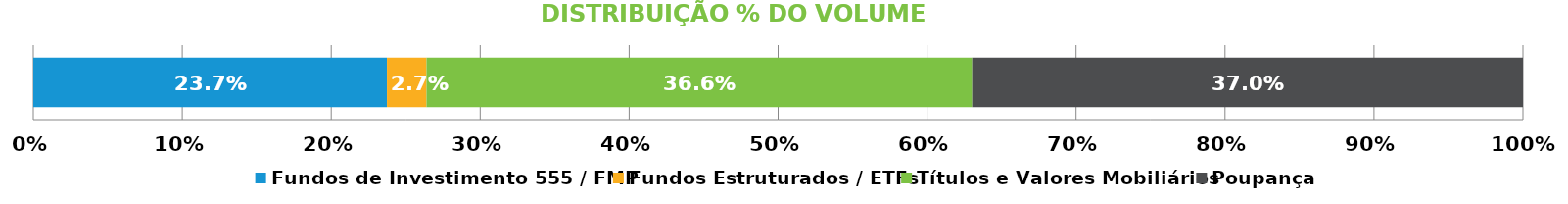
| Category | Fundos de Investimento 555 / FMP | Fundos Estruturados / ETFs | Títulos e Valores Mobiliários | Poupança |
|---|---|---|---|---|
| 0 | 0.237 | 0.027 | 0.366 | 0.37 |